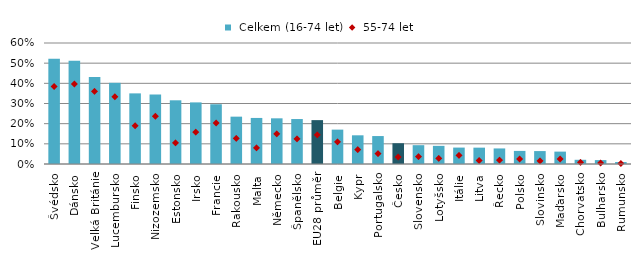
| Category |  Celkem (16-74 let) |
|---|---|
| Švédsko | 0.522 |
| Dánsko | 0.513 |
| Velká Británie | 0.431 |
| Lucembursko | 0.403 |
| Finsko | 0.35 |
| Nizozemsko | 0.344 |
| Estonsko | 0.316 |
| Irsko | 0.305 |
| Francie | 0.296 |
| Rakousko | 0.235 |
| Malta | 0.228 |
| Německo | 0.227 |
| Španělsko | 0.223 |
| EU28 průměr | 0.218 |
| Belgie | 0.17 |
| Kypr | 0.142 |
| Portugalsko | 0.139 |
| Česko | 0.103 |
| Slovensko | 0.093 |
| Lotyšsko | 0.09 |
| Itálie | 0.081 |
| Litva | 0.081 |
| Řecko | 0.077 |
| Polsko | 0.065 |
| Slovinsko | 0.064 |
| Maďarsko | 0.061 |
| Chorvatsko | 0.021 |
| Bulharsko | 0.019 |
| Rumunsko | 0.01 |